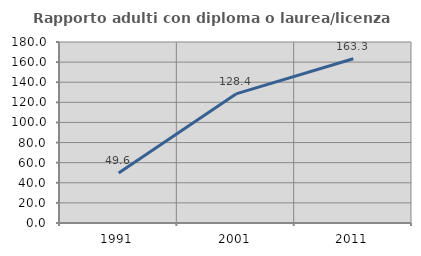
| Category | Rapporto adulti con diploma o laurea/licenza media  |
|---|---|
| 1991.0 | 49.612 |
| 2001.0 | 128.358 |
| 2011.0 | 163.333 |